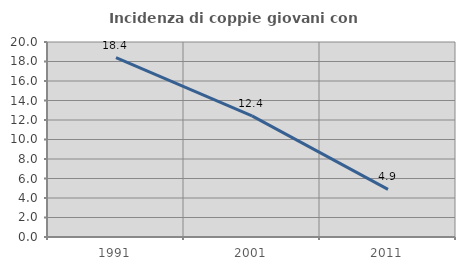
| Category | Incidenza di coppie giovani con figli |
|---|---|
| 1991.0 | 18.405 |
| 2001.0 | 12.426 |
| 2011.0 | 4.891 |